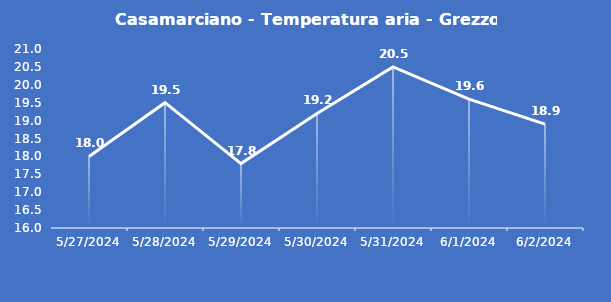
| Category | Casamarciano - Temperatura aria - Grezzo (°C) |
|---|---|
| 5/27/24 | 18 |
| 5/28/24 | 19.5 |
| 5/29/24 | 17.8 |
| 5/30/24 | 19.2 |
| 5/31/24 | 20.5 |
| 6/1/24 | 19.6 |
| 6/2/24 | 18.9 |